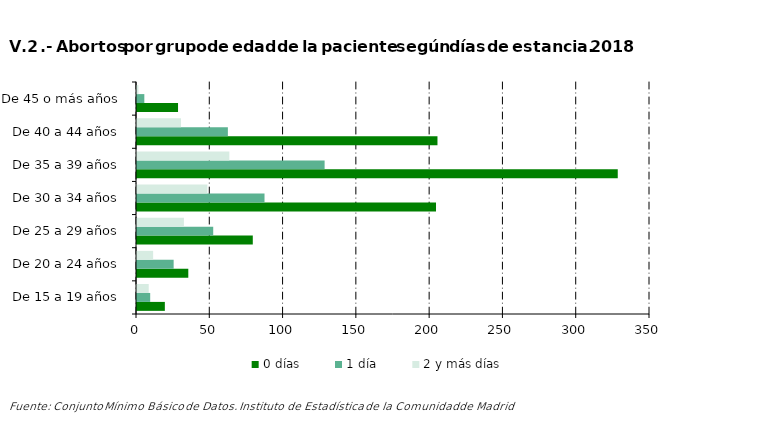
| Category | 0 días | 1 día | 2 y más días |
|---|---|---|---|
| De 15 a 19 años | 19 | 9 | 8 |
| De 20 a 24 años | 35 | 25 | 11 |
| De 25 a 29 años | 79 | 52 | 32 |
| De 30 a 34 años | 204 | 87 | 48 |
| De 35 a 39 años | 328 | 128 | 63 |
| De 40 a 44 años | 205 | 62 | 30 |
| De 45 o más años | 28 | 5 | 1 |